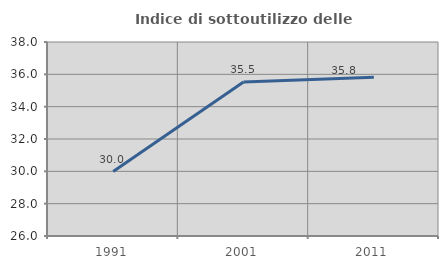
| Category | Indice di sottoutilizzo delle abitazioni  |
|---|---|
| 1991.0 | 29.989 |
| 2001.0 | 35.531 |
| 2011.0 | 35.814 |